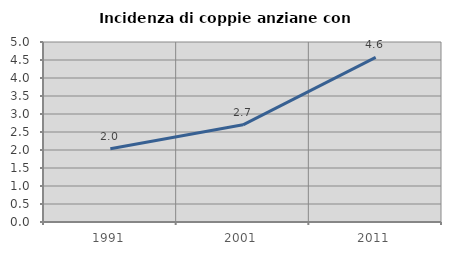
| Category | Incidenza di coppie anziane con figli |
|---|---|
| 1991.0 | 2.034 |
| 2001.0 | 2.699 |
| 2011.0 | 4.573 |